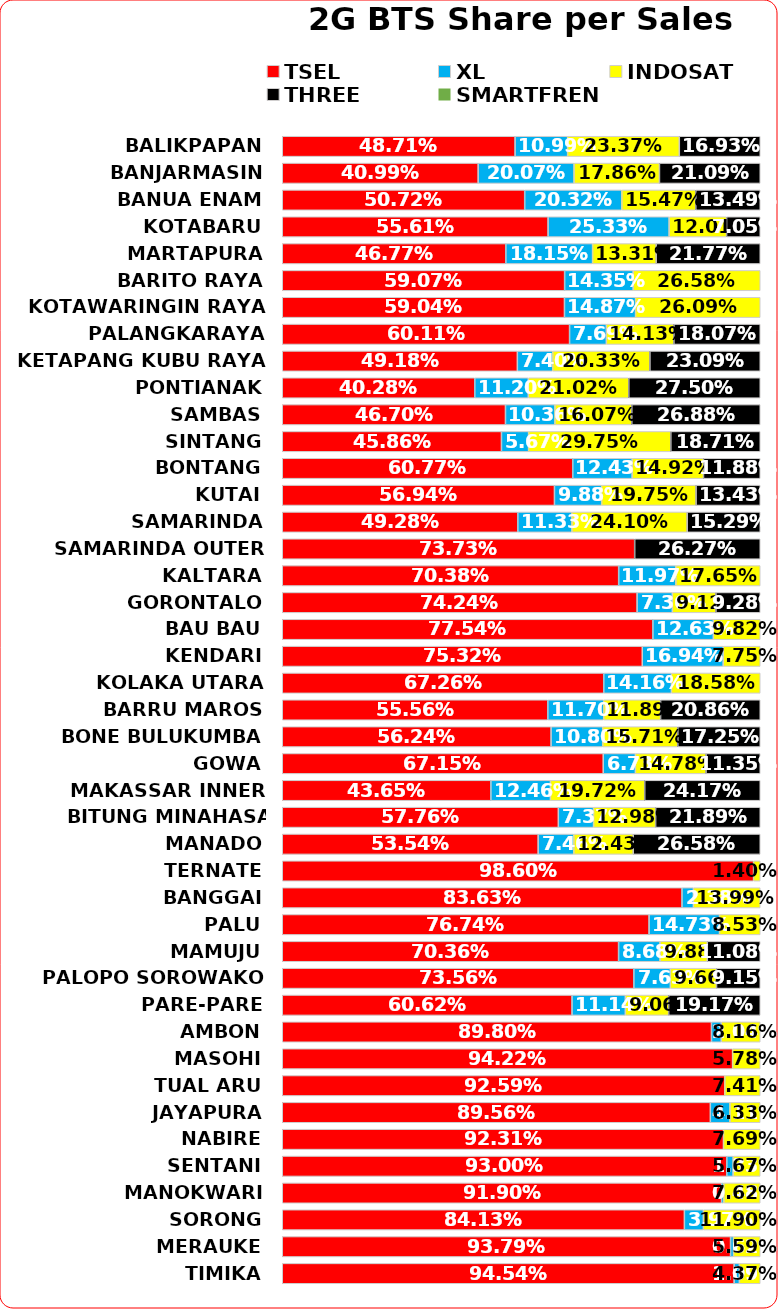
| Category | TSEL | XL | INDOSAT | THREE | SMARTFREN |
|---|---|---|---|---|---|
| BALIKPAPAN | 0.487 | 0.11 | 0.234 | 0.169 | 0 |
| BANJARMASIN | 0.41 | 0.201 | 0.179 | 0.211 | 0 |
| BANUA ENAM | 0.507 | 0.203 | 0.155 | 0.135 | 0 |
| KOTABARU | 0.556 | 0.253 | 0.12 | 0.07 | 0 |
| MARTAPURA | 0.468 | 0.181 | 0.133 | 0.218 | 0 |
| BARITO RAYA | 0.591 | 0.143 | 0.266 | 0 | 0 |
| KOTAWARINGIN RAYA | 0.59 | 0.149 | 0.261 | 0 | 0 |
| PALANGKARAYA | 0.601 | 0.077 | 0.141 | 0.181 | 0 |
| KETAPANG KUBU RAYA | 0.492 | 0.074 | 0.203 | 0.231 | 0 |
| PONTIANAK | 0.403 | 0.112 | 0.21 | 0.275 | 0 |
| SAMBAS | 0.467 | 0.104 | 0.161 | 0.269 | 0 |
| SINTANG | 0.459 | 0.057 | 0.298 | 0.187 | 0 |
| BONTANG | 0.608 | 0.124 | 0.149 | 0.119 | 0 |
| KUTAI | 0.569 | 0.099 | 0.198 | 0.134 | 0 |
| SAMARINDA | 0.493 | 0.113 | 0.241 | 0.153 | 0 |
| SAMARINDA OUTER | 0.737 | 0 | 0 | 0.263 | 0 |
| KALTARA | 0.704 | 0.12 | 0.176 | 0 | 0 |
| GORONTALO | 0.742 | 0.074 | 0.091 | 0.093 | 0 |
| BAU BAU | 0.775 | 0.126 | 0.098 | 0 | 0 |
| KENDARI | 0.753 | 0.169 | 0.077 | 0 | 0 |
| KOLAKA UTARA | 0.673 | 0.142 | 0.186 | 0 | 0 |
| BARRU MAROS | 0.556 | 0.117 | 0.119 | 0.209 | 0 |
| BONE BULUKUMBA | 0.562 | 0.108 | 0.157 | 0.173 | 0 |
| GOWA | 0.672 | 0.067 | 0.148 | 0.113 | 0 |
| MAKASSAR INNER | 0.436 | 0.125 | 0.197 | 0.242 | 0 |
| BITUNG MINAHASA TALAUD | 0.578 | 0.074 | 0.13 | 0.219 | 0 |
| MANADO | 0.535 | 0.075 | 0.124 | 0.266 | 0 |
| TERNATE | 0.986 | 0 | 0.014 | 0 | 0 |
| BANGGAI | 0.836 | 0.024 | 0.14 | 0 | 0 |
| PALU | 0.767 | 0.147 | 0.085 | 0 | 0 |
| MAMUJU | 0.704 | 0.087 | 0.099 | 0.111 | 0 |
| PALOPO SOROWAKO | 0.736 | 0.076 | 0.097 | 0.092 | 0 |
| PARE-PARE | 0.606 | 0.111 | 0.091 | 0.192 | 0 |
| AMBON | 0.898 | 0.02 | 0.082 | 0 | 0 |
| MASOHI | 0.942 | 0 | 0.058 | 0 | 0 |
| TUAL ARU | 0.926 | 0 | 0.074 | 0 | 0 |
| JAYAPURA | 0.896 | 0.041 | 0.063 | 0 | 0 |
| NABIRE | 0.923 | 0 | 0.077 | 0 | 0 |
| SENTANI | 0.93 | 0.013 | 0.057 | 0 | 0 |
| MANOKWARI | 0.919 | 0.005 | 0.076 | 0 | 0 |
| SORONG | 0.841 | 0.04 | 0.119 | 0 | 0 |
| MERAUKE | 0.938 | 0.006 | 0.056 | 0 | 0 |
| TIMIKA | 0.945 | 0.011 | 0.044 | 0 | 0 |